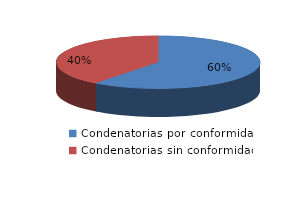
| Category | Series 0 |
|---|---|
| 0 | 32 |
| 1 | 21 |